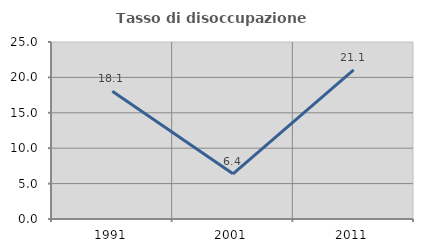
| Category | Tasso di disoccupazione giovanile  |
|---|---|
| 1991.0 | 18.056 |
| 2001.0 | 6.383 |
| 2011.0 | 21.053 |